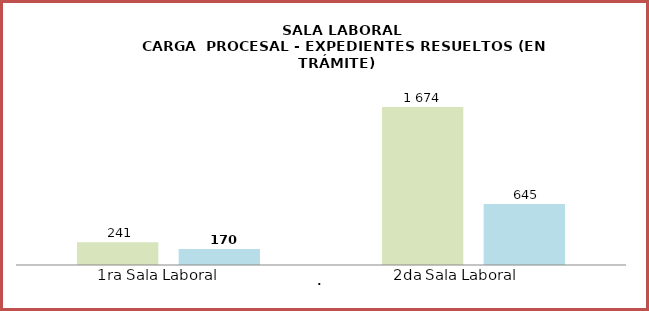
| Category | Series 0 | Series 1 | Series 2 | Series 3 | Series 4 | carga procesal |
|---|---|---|---|---|---|---|
| 0 | 241 | 170 | 0 | 1674 | 645 |  |